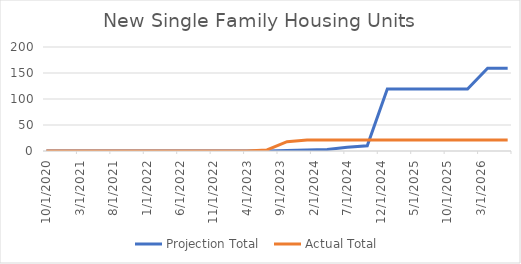
| Category | Projection Total  | Actual Total  |
|---|---|---|
| 10/1/20 | 0 | 0 |
| 1/1/21 | 0 | 0 |
| 4/1/21 | 0 | 0 |
| 7/1/21 | 0 | 0 |
| 10/1/21 | 0 | 0 |
| 1/1/22 | 0 | 0 |
| 4/1/22 | 0 | 0 |
| 7/1/22 | 0 | 0 |
| 10/1/22 | 0 | 0 |
| 1/1/23 | 0 | 0 |
| 4/1/23 | 0 | 0 |
| 7/1/23 | 0 | 2 |
| 10/1/23 | 1 | 18 |
| 1/1/24 | 2 | 21 |
| 4/1/24 | 3 | 21 |
| 7/1/24 | 7 | 21 |
| 10/1/24 | 10 | 21 |
| 1/1/25 | 119 | 21 |
| 4/1/25 | 119 | 21 |
| 7/1/25 | 119 | 21 |
| 10/1/25 | 119 | 21 |
| 1/1/26 | 119 | 21 |
| 4/1/26 | 159 | 21 |
| 7/1/26 | 159 | 21 |